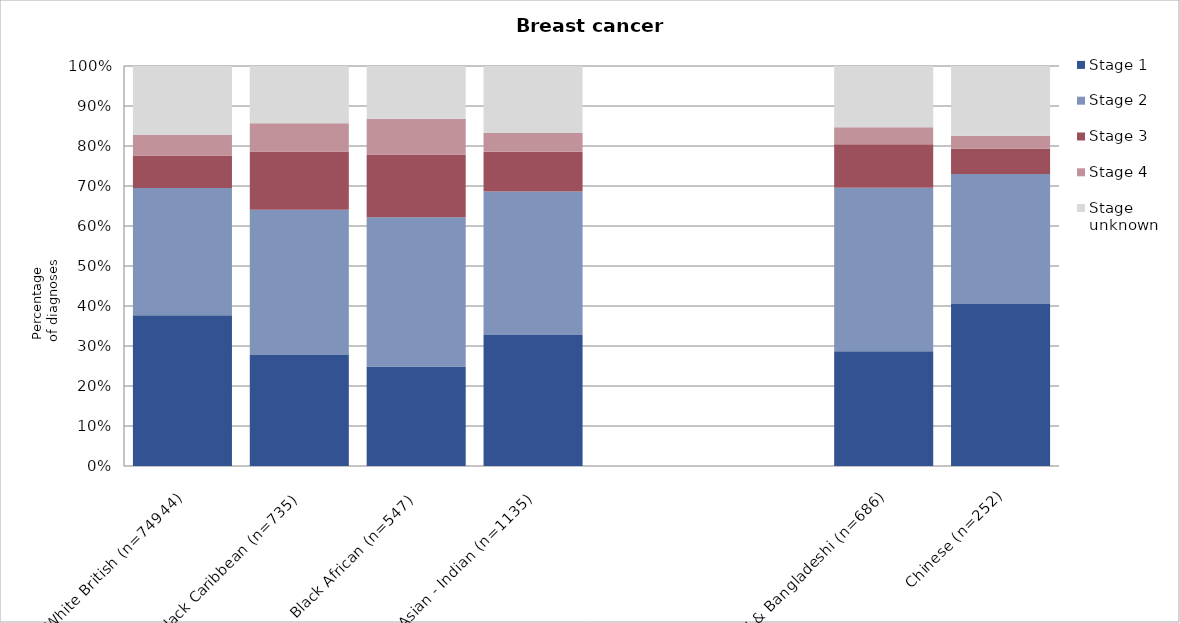
| Category | Stage 1 | Stage 2 | Stage 3 | Stage 4 | Stage unknown |
|---|---|---|---|---|---|
| White British (n=74944) | 0.377 | 0.318 | 0.081 | 0.051 | 0.173 |
| Black Caribbean (n=735) | 0.278 | 0.363 | 0.146 | 0.071 | 0.143 |
| Black African (n=547) | 0.249 | 0.373 | 0.157 | 0.09 | 0.132 |
| Asian - Indian (n=1135) | 0.328 | 0.359 | 0.1 | 0.047 | 0.167 |
|   | 0 | 0 | 0 | 0 | 0 |
|   | 0 | 0 | 0 | 0 | 0 |
| Pakistani & Bangladeshi (n=686) | 0.287 | 0.408 | 0.109 | 0.042 | 0.153 |
| Chinese (n=252) | 0.405 | 0.325 | 0.063 | 0.032 | 0.175 |